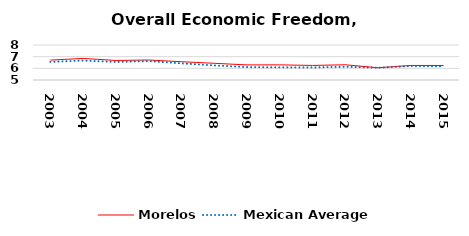
| Category | Morelos | Mexican Average  |
|---|---|---|
| 2003.0 | 6.706 | 6.552 |
| 2004.0 | 6.849 | 6.668 |
| 2005.0 | 6.674 | 6.546 |
| 2006.0 | 6.714 | 6.619 |
| 2007.0 | 6.568 | 6.428 |
| 2008.0 | 6.433 | 6.248 |
| 2009.0 | 6.293 | 6.106 |
| 2010.0 | 6.298 | 6.086 |
| 2011.0 | 6.247 | 6.074 |
| 2012.0 | 6.306 | 6.134 |
| 2013.0 | 6.05 | 6.054 |
| 2014.0 | 6.248 | 6.2 |
| 2015.0 | 6.245 | 6.174 |